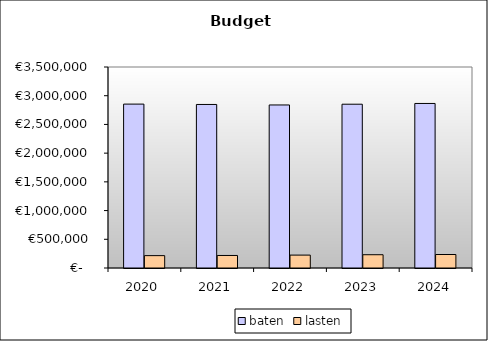
| Category | baten | lasten |
|---|---|---|
| 2020.0 | 2853968.303 | 215392.017 |
| 2021.0 | 2847808.221 | 218099.2 |
| 2022.0 | 2838872.657 | 224529.6 |
| 2023.0 | 2851954.427 | 231070.4 |
| 2024.0 | 2865036.198 | 234912 |